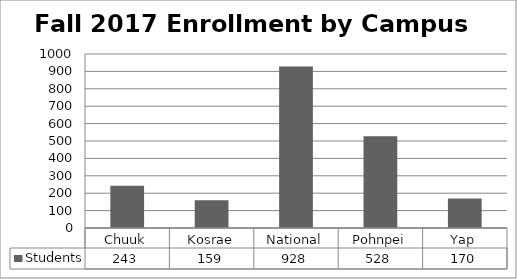
| Category | Students |
|---|---|
| Chuuk | 243 |
| Kosrae | 159 |
| National | 928 |
| Pohnpei | 528 |
| Yap | 170 |